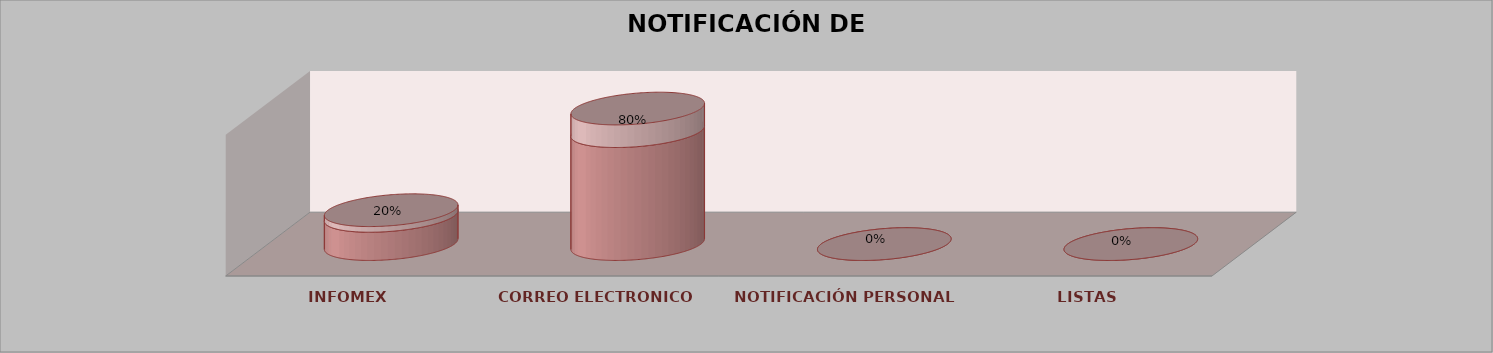
| Category | Series 0 | Series 1 | Series 2 | Series 3 | Series 4 |
|---|---|---|---|---|---|
| INFOMEX |  |  |  | 1 | 0.2 |
| CORREO ELECTRONICO |  |  |  | 4 | 0.8 |
| NOTIFICACIÓN PERSONAL |  |  |  | 0 | 0 |
| LISTAS |  |  |  | 0 | 0 |